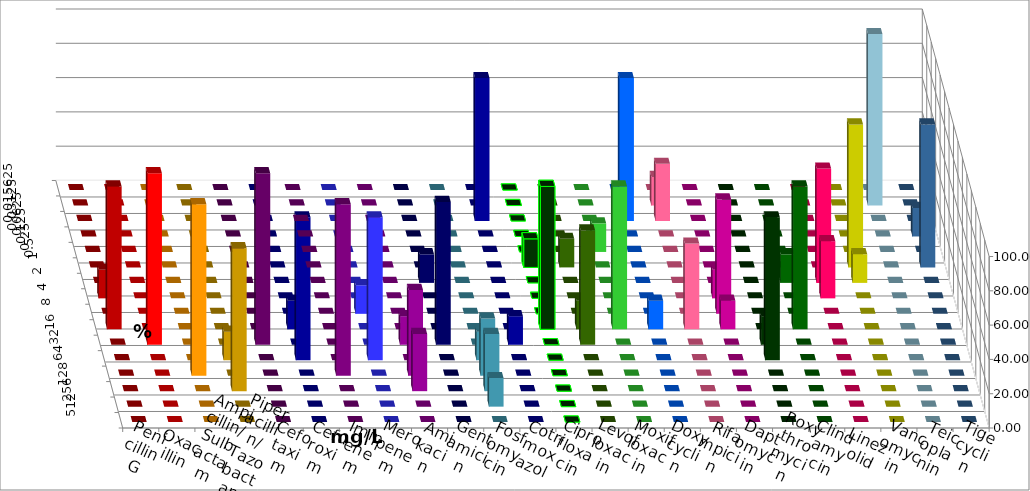
| Category | Penicillin G | Oxacillin | Ampicillin/ Sulbactam | Piperacillin/ Tazobactam | Cefotaxim | Cefuroxim | Imipenem | Meropenem | Amikacin | Gentamicin | Fosfomycin | Cotrimoxazol | Ciprofloxacin | Levofloxacin | Moxifloxacin | Doxycyclin | Rifampicin | Daptomycin | Roxythromycin | Clindamycin | Linezolid | Vancomycin | Teicoplanin | Tigecyclin |
|---|---|---|---|---|---|---|---|---|---|---|---|---|---|---|---|---|---|---|---|---|---|---|---|---|
| 0.015625 | 0 | 0 | 0 | 0 | 0 | 0 | 0 | 0 | 0 | 0 | 0 | 0 | 0 | 0 | 0 | 0 | 0 | 0 | 0 | 0 | 0 | 0 | 0 | 0 |
| 0.03125 | 0 | 0 | 0 | 0 | 0 | 0 | 0 | 0 | 0 | 0 | 0 | 0 | 0 | 0 | 0 | 0 | 16.667 | 0 | 0 | 0 | 0 | 0 | 0 | 100 |
| 0.0625 | 0 | 0 | 0 | 0 | 0 | 0 | 0 | 0 | 0 | 0 | 0 | 83.333 | 0 | 0 | 0 | 83.333 | 33.333 | 0 | 0 | 0 | 0 | 0 | 0 | 0 |
| 0.125 | 0 | 0 | 0 | 0 | 0 | 0 | 0 | 0 | 0 | 0 | 0 | 0 | 0 | 0 | 0 | 0 | 0 | 0 | 0 | 0 | 0 | 0 | 16.667 | 0 |
| 0.25 | 0 | 0 | 0 | 0 | 0 | 0 | 0 | 0 | 0 | 0 | 0 | 0 | 0 | 0 | 16.667 | 0 | 0 | 0 | 0 | 0 | 0 | 0 | 0 | 0 |
| 0.5 | 0 | 0 | 0 | 0 | 0 | 0 | 0 | 0 | 0 | 0 | 0 | 0 | 16.667 | 16.667 | 0 | 0 | 0 | 0 | 0 | 0 | 0 | 83.333 | 83.333 | 0 |
| 1.0 | 0 | 0 | 0 | 0 | 0 | 0 | 0 | 0 | 0 | 16.667 | 0 | 0 | 0 | 0 | 0 | 0 | 0 | 0 | 0 | 16.667 | 66.667 | 16.667 | 0 | 0 |
| 2.0 | 16.667 | 0 | 0 | 0 | 0 | 0 | 0 | 0 | 0 | 0 | 0 | 0 | 0 | 0 | 0 | 0 | 0 | 16.667 | 0 | 0 | 33.333 | 0 | 0 | 0 |
| 4.0 | 0 | 0 | 0 | 0 | 0 | 0 | 0 | 16.667 | 0 | 0 | 0 | 0 | 0 | 0 | 0 | 0 | 0 | 66.667 | 0 | 0 | 0 | 0 | 0 | 0 |
| 8.0 | 83.333 | 0 | 0 | 0 | 0 | 0 | 16.667 | 0 | 0 | 0 | 0 | 0 | 83.333 | 16.667 | 83.333 | 16.667 | 50 | 16.667 | 0 | 83.333 | 0 | 0 | 0 | 0 |
| 16.0 | 0 | 100 | 0 | 0 | 100 | 0 | 0 | 0 | 16.667 | 83.333 | 0 | 16.667 | 0 | 66.667 | 0 | 0 | 0 | 0 | 16.667 | 0 | 0 | 0 | 0 | 0 |
| 32.0 | 0 | 0 | 0 | 16.667 | 0 | 0 | 83.333 | 83.333 | 0 | 0 | 16.667 | 0 | 0 | 0 | 0 | 0 | 0 | 0 | 83.333 | 0 | 0 | 0 | 0 | 0 |
| 64.0 | 0 | 0 | 100 | 0 | 0 | 100 | 0 | 0 | 50 | 0 | 33.333 | 0 | 0 | 0 | 0 | 0 | 0 | 0 | 0 | 0 | 0 | 0 | 0 | 0 |
| 128.0 | 0 | 0 | 0 | 83.333 | 0 | 0 | 0 | 0 | 33.333 | 0 | 33.333 | 0 | 0 | 0 | 0 | 0 | 0 | 0 | 0 | 0 | 0 | 0 | 0 | 0 |
| 256.0 | 0 | 0 | 0 | 0 | 0 | 0 | 0 | 0 | 0 | 0 | 16.667 | 0 | 0 | 0 | 0 | 0 | 0 | 0 | 0 | 0 | 0 | 0 | 0 | 0 |
| 512.0 | 0 | 0 | 0 | 0 | 0 | 0 | 0 | 0 | 0 | 0 | 0 | 0 | 0 | 0 | 0 | 0 | 0 | 0 | 0 | 0 | 0 | 0 | 0 | 0 |